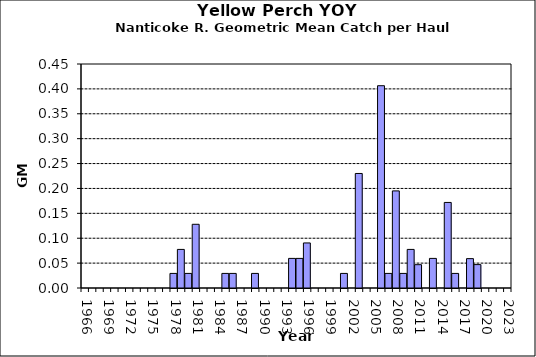
| Category | Series 0 |
|---|---|
| 1966.0 | 0 |
| 1967.0 | 0 |
| 1968.0 | 0 |
| 1969.0 | 0 |
| 1970.0 | 0 |
| 1971.0 | 0 |
| 1972.0 | 0 |
| 1973.0 | 0 |
| 1974.0 | 0 |
| 1975.0 | 0 |
| 1976.0 | 0 |
| 1977.0 | 0 |
| 1978.0 | 0.029 |
| 1979.0 | 0.078 |
| 1980.0 | 0.029 |
| 1981.0 | 0.128 |
| 1982.0 | 0 |
| 1983.0 | 0 |
| 1984.0 | 0 |
| 1985.0 | 0.029 |
| 1986.0 | 0.029 |
| 1987.0 | 0 |
| 1988.0 | 0 |
| 1989.0 | 0.029 |
| 1990.0 | 0 |
| 1991.0 | 0 |
| 1992.0 | 0 |
| 1993.0 | 0 |
| 1994.0 | 0.059 |
| 1995.0 | 0.059 |
| 1996.0 | 0.091 |
| 1997.0 | 0 |
| 1998.0 | 0 |
| 1999.0 | 0 |
| 2000.0 | 0 |
| 2001.0 | 0.029 |
| 2002.0 | 0 |
| 2003.0 | 0.23 |
| 2004.0 | 0 |
| 2005.0 | 0 |
| 2006.0 | 0.406 |
| 2007.0 | 0.029 |
| 2008.0 | 0.195 |
| 2009.0 | 0.029 |
| 2010.0 | 0.078 |
| 2011.0 | 0.047 |
| 2012.0 | 0 |
| 2013.0 | 0.059 |
| 2014.0 | 0 |
| 2015.0 | 0.172 |
| 2016.0 | 0.029 |
| 2017.0 | 0 |
| 2018.0 | 0.059 |
| 2019.0 | 0.047 |
| 2020.0 | 0 |
| 2021.0 | 0 |
| 2022.0 | 0 |
| 2023.0 | 0 |